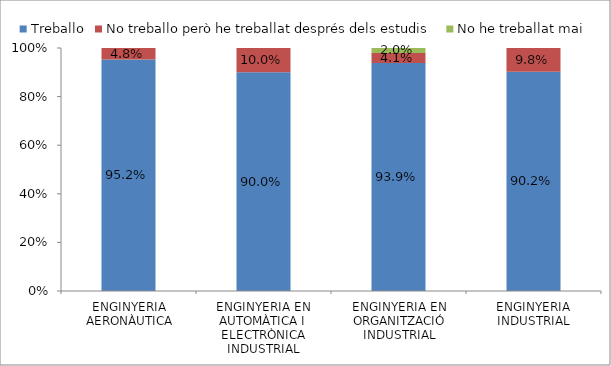
| Category | Treballo | No treballo però he treballat després dels estudis | No he treballat mai |
|---|---|---|---|
| ENGINYERIA AERONÀUTICA | 0.952 | 0.048 | 0 |
| ENGINYERIA EN AUTOMÀTICA I ELECTRÒNICA INDUSTRIAL | 0.9 | 0.1 | 0 |
| ENGINYERIA EN ORGANITZACIÓ INDUSTRIAL | 0.939 | 0.041 | 0.02 |
| ENGINYERIA INDUSTRIAL | 0.902 | 0.098 | 0 |